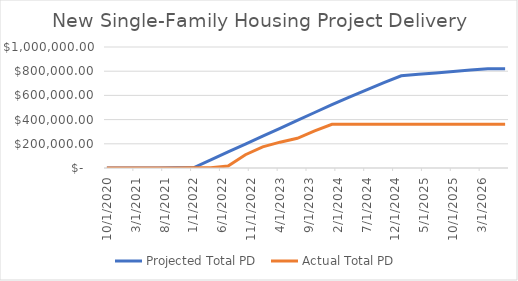
| Category | Projected Total PD  | Actual Total PD  |
|---|---|---|
| 10/1/20 | 0 | 0 |
| 1/1/21 | 0 | 0 |
| 4/1/21 | 500 | 0 |
| 7/1/21 | 1000 | 0 |
| 10/1/21 | 1500 | 0 |
| 1/1/22 | 2000 | 1456 |
| 4/1/22 | 67250.564 | 1456 |
| 7/1/22 | 132501.129 | 16641 |
| 10/1/22 | 197751.693 | 109446 |
| 1/1/23 | 263002.258 | 174419 |
| 4/1/23 | 328252.822 | 213442.48 |
| 7/1/23 | 393503.387 | 245543.48 |
| 10/1/23 | 458753.951 | 306441.17 |
| 1/1/24 | 524004.516 | 361566.38 |
| 4/1/24 | 585505.08 | 361566.38 |
| 7/1/24 | 646450.089 | 361566.38 |
| 10/1/24 | 704995.098 | 361566.38 |
| 1/1/25 | 762176.471 | 361566.38 |
| 4/1/25 | 773941.176 | 361566.38 |
| 7/1/25 | 785705.882 | 361566.38 |
| 10/1/25 | 797470.588 | 361566.38 |
| 1/1/26 | 809235.294 | 361566.38 |
| 4/1/26 | 821000 | 361566.38 |
| 7/1/26 | 821000 | 361566.38 |